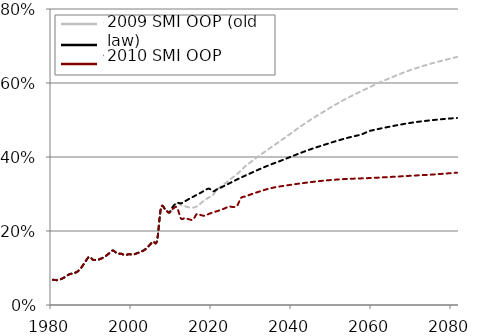
| Category | 2009 SMI OOP (old law) | 2010 SMI OOP | 2015 SMI OOP |
|---|---|---|---|
| 1980.0 | 0.069 | 0.068 | 0.068 |
| 1981.0 | 0.068 | 0.067 | 0.067 |
| 1982.0 | 0.071 | 0.07 | 0.07 |
| 1983.0 | 0.076 | 0.075 | 0.075 |
| 1984.0 | 0.083 | 0.082 | 0.082 |
| 1985.0 | 0.087 | 0.086 | 0.086 |
| 1986.0 | 0.09 | 0.089 | 0.089 |
| 1987.0 | 0.101 | 0.1 | 0.1 |
| 1988.0 | 0.116 | 0.115 | 0.115 |
| 1989.0 | 0.131 | 0.13 | 0.13 |
| 1990.0 | 0.123 | 0.122 | 0.122 |
| 1991.0 | 0.123 | 0.122 | 0.122 |
| 1992.0 | 0.127 | 0.125 | 0.125 |
| 1993.0 | 0.132 | 0.131 | 0.131 |
| 1994.0 | 0.14 | 0.139 | 0.139 |
| 1995.0 | 0.148 | 0.147 | 0.147 |
| 1996.0 | 0.14 | 0.139 | 0.139 |
| 1997.0 | 0.139 | 0.139 | 0.139 |
| 1998.0 | 0.135 | 0.135 | 0.135 |
| 1999.0 | 0.138 | 0.137 | 0.137 |
| 2000.0 | 0.137 | 0.136 | 0.136 |
| 2001.0 | 0.141 | 0.14 | 0.14 |
| 2002.0 | 0.145 | 0.144 | 0.144 |
| 2003.0 | 0.151 | 0.15 | 0.149 |
| 2004.0 | 0.161 | 0.16 | 0.16 |
| 2005.0 | 0.173 | 0.171 | 0.171 |
| 2006.0 | 0.174 | 0.173 | 0.173 |
| 2007.0 | 0.262 | 0.262 | 0.262 |
| 2008.0 | 0.26 | 0.259 | 0.26 |
| 2009.0 | 0.252 | 0.25 | 0.249 |
| 2010.0 | 0.258 | 0.266 | 0.26 |
| 2011.0 | 0.278 | 0.276 | 0.263 |
| 2012.0 | 0.27 | 0.275 | 0.234 |
| 2013.0 | 0.267 | 0.28 | 0.235 |
| 2014.0 | 0.264 | 0.287 | 0.232 |
| 2015.0 | 0.263 | 0.292 | 0.231 |
| 2016.0 | 0.267 | 0.298 | 0.246 |
| 2017.0 | 0.275 | 0.304 | 0.243 |
| 2018.0 | 0.284 | 0.31 | 0.241 |
| 2019.0 | 0.291 | 0.315 | 0.246 |
| 2020.0 | 0.297 | 0.307 | 0.25 |
| 2021.0 | 0.312 | 0.313 | 0.254 |
| 2022.0 | 0.32 | 0.317 | 0.257 |
| 2023.0 | 0.329 | 0.323 | 0.261 |
| 2024.0 | 0.337 | 0.328 | 0.266 |
| 2025.0 | 0.345 | 0.334 | 0.265 |
| 2026.0 | 0.354 | 0.339 | 0.268 |
| 2027.0 | 0.364 | 0.344 | 0.289 |
| 2028.0 | 0.374 | 0.349 | 0.293 |
| 2029.0 | 0.383 | 0.354 | 0.297 |
| 2030.0 | 0.391 | 0.359 | 0.301 |
| 2031.0 | 0.399 | 0.364 | 0.305 |
| 2032.0 | 0.407 | 0.369 | 0.308 |
| 2033.0 | 0.415 | 0.373 | 0.311 |
| 2034.0 | 0.422 | 0.378 | 0.315 |
| 2035.0 | 0.43 | 0.382 | 0.317 |
| 2036.0 | 0.437 | 0.386 | 0.319 |
| 2037.0 | 0.445 | 0.39 | 0.321 |
| 2038.0 | 0.452 | 0.394 | 0.323 |
| 2039.0 | 0.46 | 0.399 | 0.324 |
| 2040.0 | 0.468 | 0.403 | 0.326 |
| 2041.0 | 0.476 | 0.407 | 0.327 |
| 2042.0 | 0.483 | 0.411 | 0.329 |
| 2043.0 | 0.491 | 0.415 | 0.33 |
| 2044.0 | 0.498 | 0.419 | 0.332 |
| 2045.0 | 0.505 | 0.423 | 0.333 |
| 2046.0 | 0.512 | 0.427 | 0.334 |
| 2047.0 | 0.518 | 0.43 | 0.335 |
| 2048.0 | 0.525 | 0.434 | 0.336 |
| 2049.0 | 0.531 | 0.437 | 0.337 |
| 2050.0 | 0.538 | 0.44 | 0.338 |
| 2051.0 | 0.544 | 0.444 | 0.339 |
| 2052.0 | 0.55 | 0.447 | 0.34 |
| 2053.0 | 0.556 | 0.45 | 0.34 |
| 2054.0 | 0.562 | 0.453 | 0.341 |
| 2055.0 | 0.567 | 0.455 | 0.341 |
| 2056.0 | 0.572 | 0.458 | 0.342 |
| 2057.0 | 0.577 | 0.46 | 0.342 |
| 2058.0 | 0.583 | 0.465 | 0.343 |
| 2059.0 | 0.588 | 0.47 | 0.343 |
| 2060.0 | 0.593 | 0.472 | 0.344 |
| 2061.0 | 0.598 | 0.475 | 0.344 |
| 2062.0 | 0.603 | 0.477 | 0.345 |
| 2063.0 | 0.608 | 0.479 | 0.345 |
| 2064.0 | 0.612 | 0.482 | 0.346 |
| 2065.0 | 0.617 | 0.484 | 0.347 |
| 2066.0 | 0.621 | 0.486 | 0.347 |
| 2067.0 | 0.625 | 0.488 | 0.348 |
| 2068.0 | 0.63 | 0.49 | 0.348 |
| 2069.0 | 0.634 | 0.492 | 0.349 |
| 2070.0 | 0.637 | 0.493 | 0.35 |
| 2071.0 | 0.641 | 0.495 | 0.35 |
| 2072.0 | 0.644 | 0.496 | 0.351 |
| 2073.0 | 0.648 | 0.497 | 0.351 |
| 2074.0 | 0.651 | 0.499 | 0.352 |
| 2075.0 | 0.654 | 0.5 | 0.353 |
| 2076.0 | 0.657 | 0.501 | 0.353 |
| 2077.0 | 0.66 | 0.502 | 0.354 |
| 2078.0 | 0.662 | 0.503 | 0.355 |
| 2079.0 | 0.665 | 0.504 | 0.356 |
| 2080.0 | 0.668 | 0.505 | 0.357 |
| 2081.0 | 0.67 | 0.505 | 0.358 |